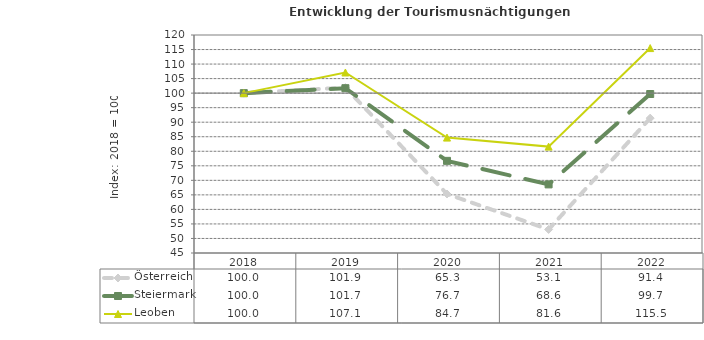
| Category | Österreich | Steiermark | Leoben |
|---|---|---|---|
| 2022.0 | 91.4 | 99.7 | 115.5 |
| 2021.0 | 53.1 | 68.6 | 81.6 |
| 2020.0 | 65.3 | 76.7 | 84.7 |
| 2019.0 | 101.9 | 101.7 | 107.1 |
| 2018.0 | 100 | 100 | 100 |